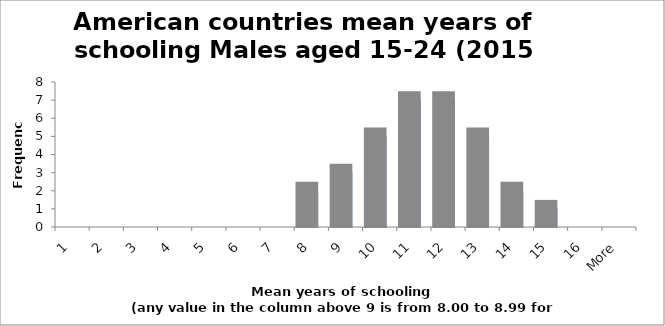
| Category | Frequency |
|---|---|
| 1 | 0 |
| 2 | 0 |
| 3 | 0 |
| 4 | 0 |
| 5 | 0 |
| 6 | 0 |
| 7 | 0 |
| 8 | 2 |
| 9 | 3 |
| 10 | 5 |
| 11 | 7 |
| 12 | 7 |
| 13 | 5 |
| 14 | 2 |
| 15 | 1 |
| 16 | 0 |
| More | 0 |